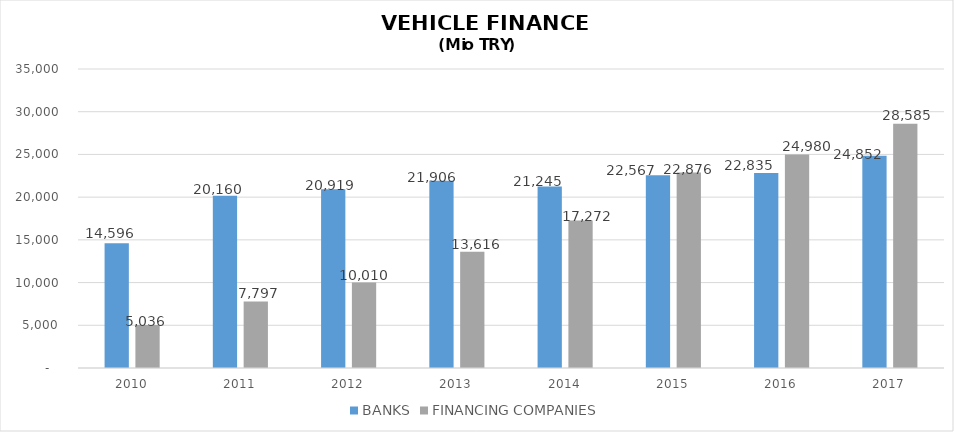
| Category | BANKS | FINANCING COMPANIES |
|---|---|---|
| 2010 | 14596 | 5035.89 |
| 2011 | 20160 | 7796.854 |
| 2012 | 20919 | 10009.755 |
| 2013 | 21906 | 13616.036 |
| 2014 | 21245 | 17271.844 |
| 2015 | 22567 | 22875.563 |
| 2016 | 22835 | 24980.231 |
| 2017 | 24852 | 28584.938 |